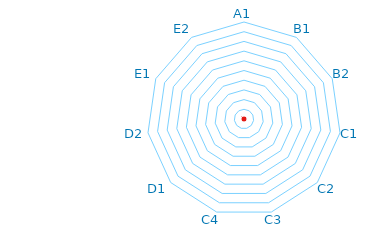
| Category | Auswertung |
|---|---|
| A1 | 0 |
| B1 | 0 |
| B2 | 0 |
| C1 | 0 |
| C2 | 0 |
| C3 | 0 |
| C4 | 0 |
| D1 | 0 |
| D2 | 0 |
| E1 | 0 |
| E2 | 0 |